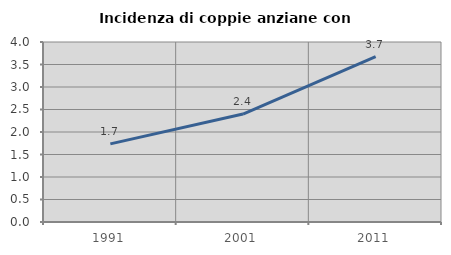
| Category | Incidenza di coppie anziane con figli |
|---|---|
| 1991.0 | 1.737 |
| 2001.0 | 2.399 |
| 2011.0 | 3.674 |